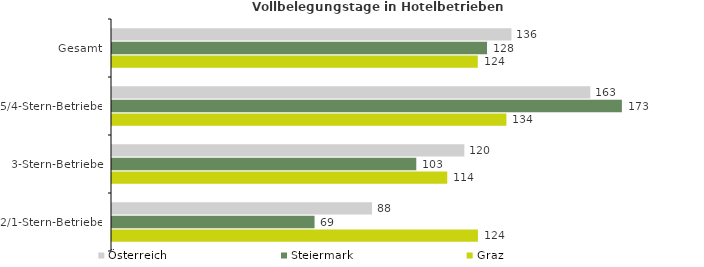
| Category | Österreich | Steiermark | Graz |
|---|---|---|---|
| Gesamt | 135.866 | 127.561 | 124.414 |
| 5/4-Stern-Betriebe | 162.683 | 173.435 | 134.149 |
| 3-Stern-Betriebe | 119.851 | 103.499 | 114.036 |
| 2/1-Stern-Betriebe | 88.435 | 68.894 | 124.463 |